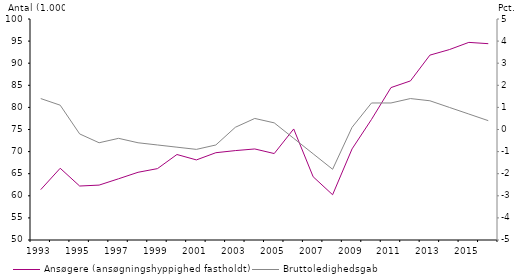
| Category | Ansøgere (ansøgningshyppighed fastholdt) |
|---|---|
| 1993.0 | 61395 |
| 1994.0 | 66232 |
| 1995.0 | 62212 |
| 1996.0 | 62419 |
| 1997.0 | 63851 |
| 1998.0 | 65318 |
| 1999.0 | 66151 |
| 2000.0 | 69341 |
| 2001.0 | 68118 |
| 2002.0 | 69750 |
| 2003.0 | 70225 |
| 2004.0 | 70596 |
| 2005.0 | 69558 |
| 2006.0 | 75122 |
| 2007.0 | 64309 |
| 2008.0 | 60240 |
| 2009.0 | 70611 |
| 2010.0 | 77284 |
| 2011.0 | 84484 |
| 2012.0 | 85992 |
| 2013.0 | 91825 |
| 2014.0 | 93077 |
| 2015.0 | 94711 |
| 2016.0 | 94417 |